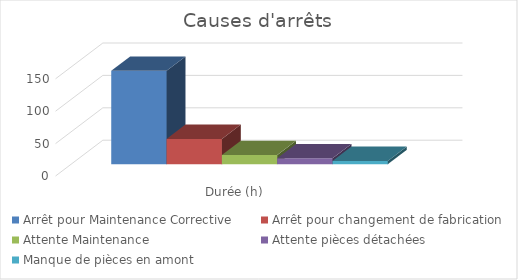
| Category | Arrêt pour Maintenance Corrective | Arrêt pour changement de fabrication | Attente Maintenance | Attente pièces détachées | Manque de pièces en amont |
|---|---|---|---|---|---|
| Durée (h) | 144 | 39 | 14 | 9 | 5 |